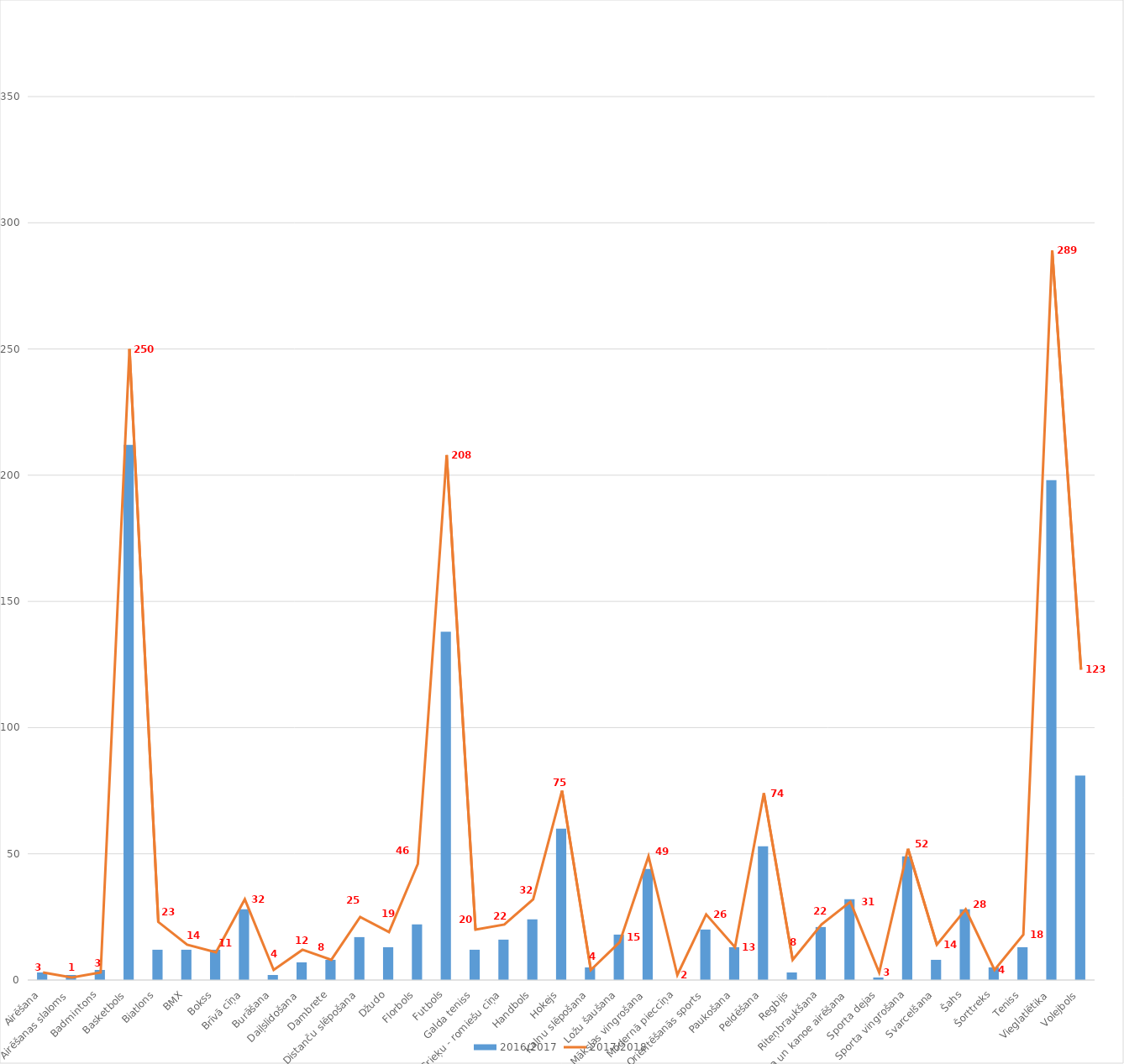
| Category | 2016/2017 |
|---|---|
| Airēšana | 3 |
| Airēšanas slaloms | 2 |
| Badmintons | 4 |
| Basketbols | 212 |
| Biatlons | 12 |
| BMX | 12 |
| Bokss | 12 |
| Brīvā cīņa | 28 |
| Burāšana | 2 |
| Daiļslidošana | 7 |
| Dambrete | 8 |
| Distanču slēpošana | 17 |
| Džudo | 13 |
| Florbols | 22 |
| Futbols | 138 |
| Galda teniss | 12 |
| Grieķu - romiešu cīņa | 16 |
| Handbols | 24 |
| Hokejs | 60 |
| Kalnu slēpošana | 5 |
| Ložu šaušana | 18 |
| Mākslas vingrošana | 44 |
| Modernā pieccīņa | 0 |
| Orientēšanās sports | 20 |
| Paukošana | 13 |
| Peldēšana | 53 |
| Regbijs | 3 |
| Riteņbraukšana | 21 |
| Smaiļošana un kanoe airēšana | 32 |
| Sporta dejas | 1 |
| Sporta vingrošana | 49 |
| Svarcelšana | 8 |
| Šahs | 28 |
| Šorttreks | 5 |
| Teniss | 13 |
| Vieglatlētika | 198 |
| Volejbols | 81 |